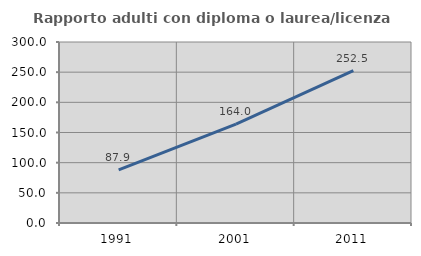
| Category | Rapporto adulti con diploma o laurea/licenza media  |
|---|---|
| 1991.0 | 87.929 |
| 2001.0 | 163.991 |
| 2011.0 | 252.48 |